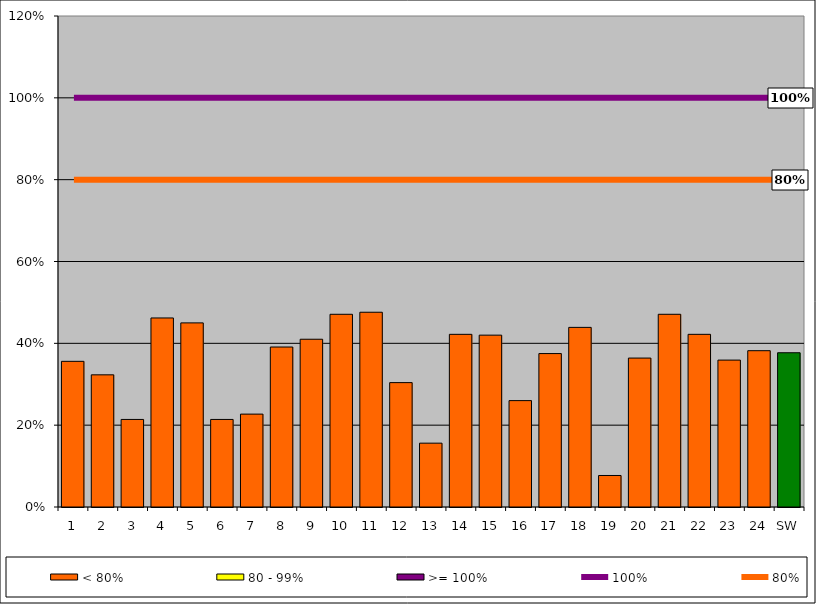
| Category | < 80% | 80 - 99% | >= 100% |
|---|---|---|---|
| 1 | 0.356 | 0 | 0 |
| 2 | 0.323 | 0 | 0 |
| 3 | 0.214 | 0 | 0 |
| 4 | 0.462 | 0 | 0 |
| 5 | 0.45 | 0 | 0 |
| 6 | 0.214 | 0 | 0 |
| 7 | 0.227 | 0 | 0 |
| 8 | 0.391 | 0 | 0 |
| 9 | 0.41 | 0 | 0 |
| 10 | 0.471 | 0 | 0 |
| 11 | 0.476 | 0 | 0 |
| 12 | 0.304 | 0 | 0 |
| 13 | 0.156 | 0 | 0 |
| 14 | 0.422 | 0 | 0 |
| 15 | 0.42 | 0 | 0 |
| 16 | 0.26 | 0 | 0 |
| 17 | 0.375 | 0 | 0 |
| 18 | 0.439 | 0 | 0 |
| 19 | 0.077 | 0 | 0 |
| 20 | 0.364 | 0 | 0 |
| 21 | 0.471 | 0 | 0 |
| 22 | 0.422 | 0 | 0 |
| 23 | 0.359 | 0 | 0 |
| 24 | 0.382 | 0 | 0 |
| SW | 0.377 | 0 | 0 |